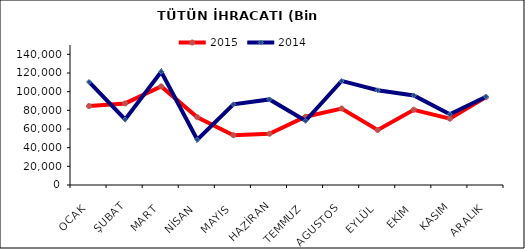
| Category | 2015 | 2014 |
|---|---|---|
| OCAK | 84587.382 | 110402.029 |
| ŞUBAT | 87419.751 | 70209.108 |
| MART | 105669.318 | 121384.389 |
| NİSAN | 72638.579 | 48540.42 |
| MAYIS | 53359.857 | 86381.493 |
| HAZİRAN | 54936.205 | 91684.593 |
| TEMMUZ | 73120.95 | 68872.548 |
| AGUSTOS | 81940.677 | 111508.17 |
| EYLÜL | 58905.846 | 101496.207 |
| EKİM | 80593.647 | 95956.638 |
| KASIM | 71026.911 | 75721.907 |
| ARALIK | 94158.055 | 94615.249 |